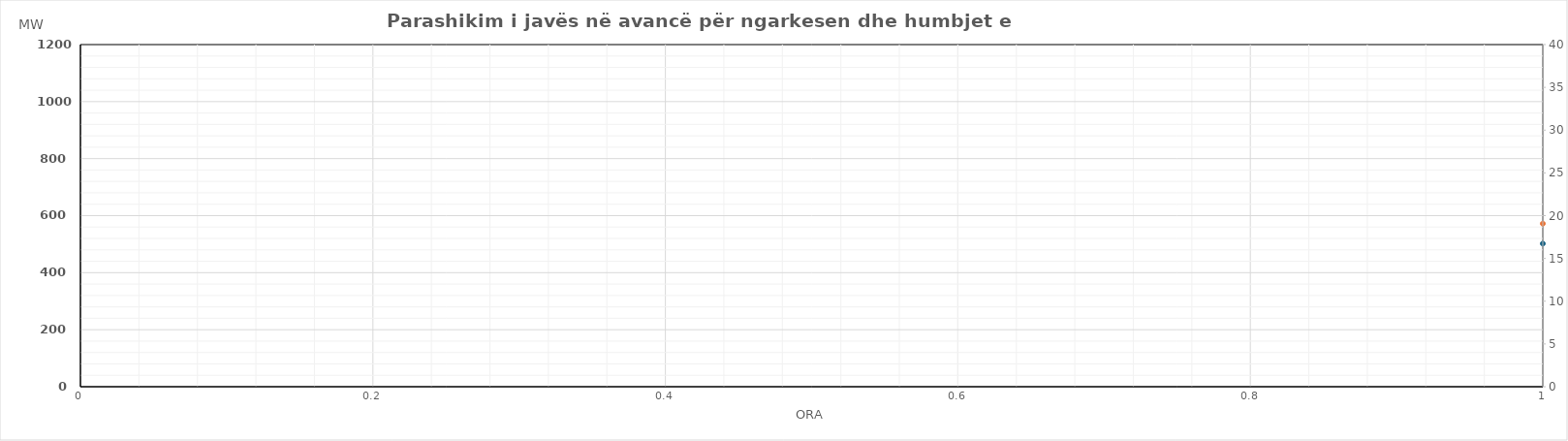
| Category | Ngarkesa (MWh) |
|---|---|
| 0 | 571.88 |
| 1 | 512.16 |
| 2 | 487.62 |
| 3 | 514.6 |
| 4 | 530.41 |
| 5 | 576.18 |
| 6 | 672.46 |
| 7 | 820.47 |
| 8 | 912.98 |
| 9 | 937.65 |
| 10 | 916.8 |
| 11 | 904.1 |
| 12 | 850.94 |
| 13 | 862.06 |
| 14 | 771.28 |
| 15 | 783.45 |
| 16 | 720.38 |
| 17 | 745.47 |
| 18 | 780.29 |
| 19 | 838.63 |
| 20 | 908.91 |
| 21 | 848.35 |
| 22 | 737.74 |
| 23 | 626.78 |
| 24 | 569.8 |
| 25 | 515.57 |
| 26 | 483.04 |
| 27 | 525.92 |
| 28 | 535.63 |
| 29 | 574.4 |
| 30 | 686.89 |
| 31 | 850.33 |
| 32 | 894.9 |
| 33 | 883.67 |
| 34 | 887.12 |
| 35 | 876.82 |
| 36 | 853.76 |
| 37 | 852.28 |
| 38 | 819 |
| 39 | 735.67 |
| 40 | 687.89 |
| 41 | 728.56 |
| 42 | 807.77 |
| 43 | 873.36 |
| 44 | 910.53 |
| 45 | 852.97 |
| 46 | 741.07 |
| 47 | 604.75 |
| 48 | 523.51 |
| 49 | 464.77 |
| 50 | 438.34 |
| 51 | 480.03 |
| 52 | 521.46 |
| 53 | 538.61 |
| 54 | 594.13 |
| 55 | 732.77 |
| 56 | 842.56 |
| 57 | 836.86 |
| 58 | 792.24 |
| 59 | 775.7 |
| 60 | 781.63 |
| 61 | 796.83 |
| 62 | 759.63 |
| 63 | 713.87 |
| 64 | 717.9 |
| 65 | 786.91 |
| 66 | 871.17 |
| 67 | 919.67 |
| 68 | 985.77 |
| 69 | 920.88 |
| 70 | 807.03 |
| 71 | 692.8 |
| 72 | 553.54 |
| 73 | 491.6 |
| 74 | 464.37 |
| 75 | 504.66 |
| 76 | 531.48 |
| 77 | 542.93 |
| 78 | 624.36 |
| 79 | 760.78 |
| 80 | 848.83 |
| 81 | 848.69 |
| 82 | 812.23 |
| 83 | 779.72 |
| 84 | 761.07 |
| 85 | 801.69 |
| 86 | 786.21 |
| 87 | 748.66 |
| 88 | 758.01 |
| 89 | 817.18 |
| 90 | 883 |
| 91 | 925.2 |
| 92 | 990.77 |
| 93 | 910.82 |
| 94 | 812.11 |
| 95 | 697.91 |
| 96 | 579.3 |
| 97 | 532.86 |
| 98 | 500.82 |
| 99 | 542.6 |
| 100 | 569.52 |
| 101 | 583.08 |
| 102 | 671.29 |
| 103 | 823.91 |
| 104 | 899.28 |
| 105 | 891.95 |
| 106 | 841.68 |
| 107 | 819.37 |
| 108 | 803.62 |
| 109 | 804.73 |
| 110 | 793.77 |
| 111 | 754.44 |
| 112 | 754.99 |
| 113 | 807.55 |
| 114 | 878.84 |
| 115 | 973.93 |
| 116 | 983.11 |
| 117 | 906.26 |
| 118 | 808.05 |
| 119 | 682.14 |
| 120 | 623.61 |
| 121 | 558.57 |
| 122 | 534.43 |
| 123 | 535.13 |
| 124 | 557.64 |
| 125 | 571.5 |
| 126 | 626.05 |
| 127 | 747.74 |
| 128 | 858.41 |
| 129 | 888.11 |
| 130 | 841.35 |
| 131 | 816.99 |
| 132 | 791.07 |
| 133 | 803.37 |
| 134 | 760.9 |
| 135 | 751.27 |
| 136 | 719.1 |
| 137 | 757.56 |
| 138 | 847.96 |
| 139 | 905.37 |
| 140 | 921.93 |
| 141 | 860.08 |
| 142 | 773.28 |
| 143 | 663.05 |
| 144 | 639.81 |
| 145 | 563.67 |
| 146 | 566.42 |
| 147 | 568.71 |
| 148 | 589.23 |
| 149 | 542.28 |
| 150 | 586.7 |
| 151 | 687.34 |
| 152 | 790.09 |
| 153 | 851.57 |
| 154 | 849.01 |
| 155 | 784.7 |
| 156 | 793.55 |
| 157 | 778.65 |
| 158 | 748.97 |
| 159 | 730.05 |
| 160 | 674.29 |
| 161 | 736.65 |
| 162 | 800.77 |
| 163 | 901.75 |
| 164 | 955.53 |
| 165 | 885.69 |
| 166 | 778.59 |
| 167 | 645.07 |